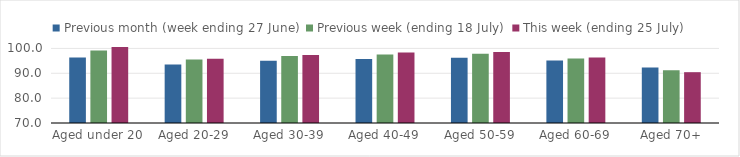
| Category | Previous month (week ending 27 June) | Previous week (ending 18 July) | This week (ending 25 July) |
|---|---|---|---|
| Aged under 20 | 96.364 | 99.135 | 100.617 |
| Aged 20-29 | 93.53 | 95.578 | 95.825 |
| Aged 30-39 | 95.019 | 96.92 | 97.385 |
| Aged 40-49 | 95.781 | 97.577 | 98.368 |
| Aged 50-59 | 96.217 | 97.833 | 98.523 |
| Aged 60-69 | 95.164 | 95.936 | 96.378 |
| Aged 70+ | 92.376 | 91.204 | 90.445 |